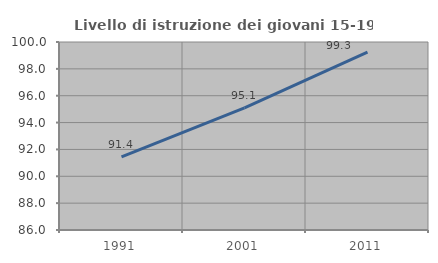
| Category | Livello di istruzione dei giovani 15-19 anni |
|---|---|
| 1991.0 | 91.438 |
| 2001.0 | 95.087 |
| 2011.0 | 99.252 |